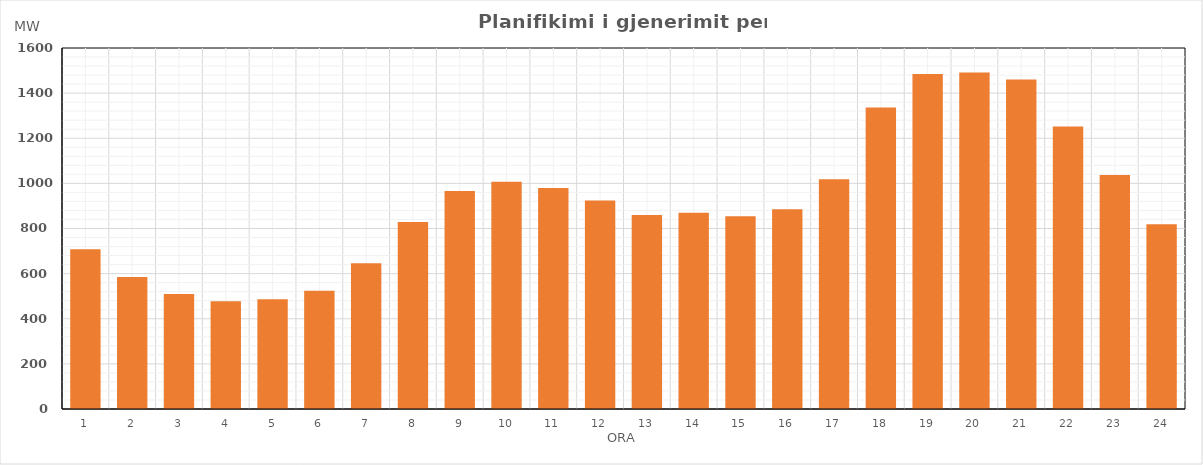
| Category | Max (MW) |
|---|---|
| 0 | 708.08 |
| 1 | 585.36 |
| 2 | 510.13 |
| 3 | 477.75 |
| 4 | 486.53 |
| 5 | 524.62 |
| 6 | 645.88 |
| 7 | 829.06 |
| 8 | 966.38 |
| 9 | 1007.3 |
| 10 | 979.47 |
| 11 | 923.77 |
| 12 | 859.28 |
| 13 | 869.44 |
| 14 | 854.78 |
| 15 | 885.17 |
| 16 | 1018.27 |
| 17 | 1336.52 |
| 18 | 1484.51 |
| 19 | 1491.38 |
| 20 | 1460.64 |
| 21 | 1252.33 |
| 22 | 1037.64 |
| 23 | 818.73 |